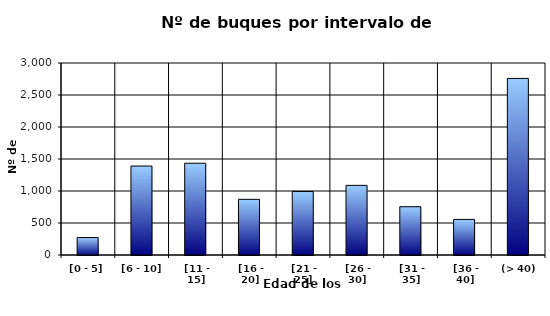
| Category | [0 - 5] |
|---|---|
| [0 - 5] | 272 |
|  [6 - 10] | 1390 |
|  [11 - 15] | 1434 |
|  [16 - 20] | 870 |
|  [21 - 25] | 993 |
|  [26 - 30] | 1088 |
|  [31 - 35] | 754 |
|  [36 - 40] | 556 |
|  (> 40) | 2759 |